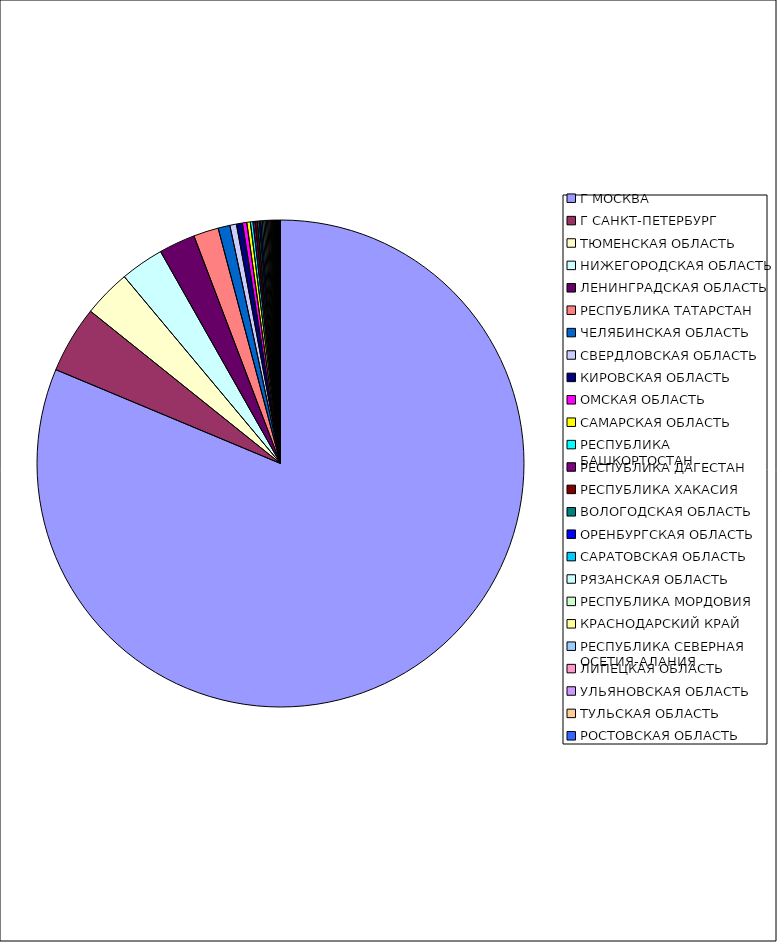
| Category | Оборот |
|---|---|
| Г МОСКВА | 0.813 |
| Г САНКТ-ПЕТЕРБУРГ | 0.045 |
| ТЮМЕНСКАЯ ОБЛАСТЬ | 0.032 |
| НИЖЕГОРОДСКАЯ ОБЛАСТЬ | 0.029 |
| ЛЕНИНГРАДСКАЯ ОБЛАСТЬ | 0.024 |
| РЕСПУБЛИКА ТАТАРСТАН | 0.017 |
| ЧЕЛЯБИНСКАЯ ОБЛАСТЬ | 0.008 |
| СВЕРДЛОВСКАЯ ОБЛАСТЬ | 0.004 |
| КИРОВСКАЯ ОБЛАСТЬ | 0.004 |
| ОМСКАЯ ОБЛАСТЬ | 0.003 |
| САМАРСКАЯ ОБЛАСТЬ | 0.002 |
| РЕСПУБЛИКА БАШКОРТОСТАН | 0.002 |
| РЕСПУБЛИКА ДАГЕСТАН | 0.001 |
| РЕСПУБЛИКА ХАКАСИЯ | 0.001 |
| ВОЛОГОДСКАЯ ОБЛАСТЬ | 0.001 |
| ОРЕНБУРГСКАЯ ОБЛАСТЬ | 0.001 |
| САРАТОВСКАЯ ОБЛАСТЬ | 0.001 |
| РЯЗАНСКАЯ ОБЛАСТЬ | 0.001 |
| РЕСПУБЛИКА МОРДОВИЯ | 0.001 |
| КРАСНОДАРСКИЙ КРАЙ | 0.001 |
| РЕСПУБЛИКА СЕВЕРНАЯ ОСЕТИЯ-АЛАНИЯ | 0.001 |
| ЛИПЕЦКАЯ ОБЛАСТЬ | 0.001 |
| УЛЬЯНОВСКАЯ ОБЛАСТЬ | 0.001 |
| ТУЛЬСКАЯ ОБЛАСТЬ | 0.001 |
| РОСТОВСКАЯ ОБЛАСТЬ | 0.001 |
| ИВАНОВСКАЯ ОБЛАСТЬ | 0.001 |
| ИРКУТСКАЯ ОБЛАСТЬ | 0.001 |
| КАБАРДИНО-БАЛКАРСКАЯ РЕСПУБЛИКА | 0 |
| ПРИМОРСКИЙ КРАЙ | 0 |
| КАЛУЖСКАЯ ОБЛАСТЬ | 0 |
| БЕЛГОРОДСКАЯ ОБЛАСТЬ | 0 |
| СМОЛЕНСКАЯ ОБЛАСТЬ | 0 |
| ПСКОВСКАЯ ОБЛАСТЬ | 0 |
| НОВОСИБИРСКАЯ ОБЛАСТЬ | 0 |
| УДМУРТСКАЯ РЕСПУБЛИКА | 0 |
| КУРСКАЯ ОБЛАСТЬ | 0 |
| АЛТАЙСКИЙ КРАЙ | 0 |
| СТАВРОПОЛЬСКИЙ КРАЙ | 0 |
| ЧУВАШСКАЯ РЕСПУБЛИКА | 0 |
| КРАСНОЯРСКИЙ КРАЙ | 0 |
| РЕСПУБЛИКА КОМИ | 0 |
| РЕСПУБЛИКА КАРЕЛИЯ | 0 |
| РЕСПУБЛИКА САХА(ЯКУТИЯ) | 0 |
| ТАМБОВСКАЯ ОБЛАСТЬ | 0 |
| КОСТРОМСКАЯ ОБЛАСТЬ | 0 |
| ПЕРМСКИЙ КРАЙ | 0 |